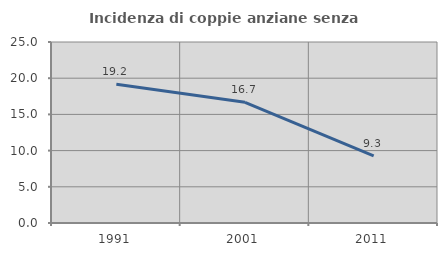
| Category | Incidenza di coppie anziane senza figli  |
|---|---|
| 1991.0 | 19.178 |
| 2001.0 | 16.667 |
| 2011.0 | 9.272 |